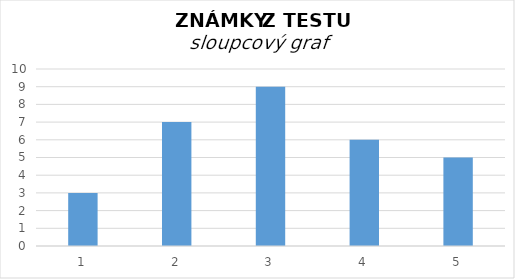
| Category | četnost |
|---|---|
| 1.0 | 3 |
| 2.0 | 7 |
| 3.0 | 9 |
| 4.0 | 6 |
| 5.0 | 5 |